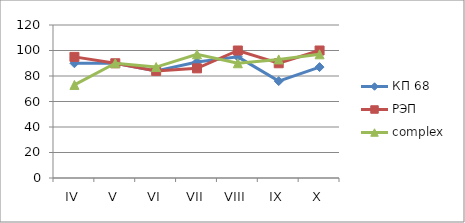
| Category | КП 68 | РЭП  | complex |
|---|---|---|---|
| IV | 90 | 95 | 73 |
| V | 90 | 90 | 90 |
| VI | 84 | 84 | 87 |
| VII | 91 | 86 | 97 |
| VIII | 95 | 100 | 90 |
| IX | 76 | 90 | 93 |
| X | 87 | 100 | 97 |